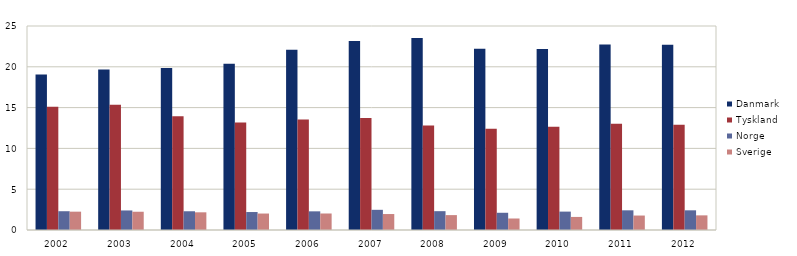
| Category | Danmark | Tyskland | Norge | Sverige |
|---|---|---|---|---|
| 2002 | 19.071 | 15.113 | 2.301 | 2.247 |
| 2003 | 19.664 | 15.343 | 2.396 | 2.238 |
| 2004 | 19.863 | 13.938 | 2.297 | 2.168 |
| 2005 | 20.363 | 13.186 | 2.202 | 2.018 |
| 2006 | 22.084 | 13.527 | 2.287 | 2.023 |
| 2007 | 23.172 | 13.732 | 2.474 | 1.957 |
| 2008 | 23.52 | 12.796 | 2.307 | 1.825 |
| 2009 | 22.212 | 12.397 | 2.112 | 1.409 |
| 2010 | 22.172 | 12.662 | 2.254 | 1.601 |
| 2011 | 22.718 | 13.011 | 2.413 | 1.772 |
| 2012 | 22.708 | 12.911 | 2.412 | 1.794 |